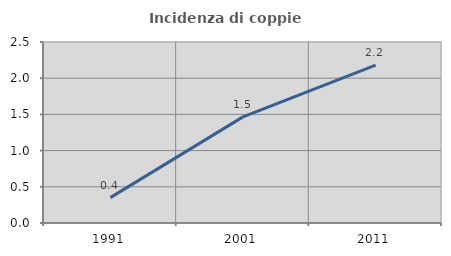
| Category | Incidenza di coppie miste |
|---|---|
| 1991.0 | 0.351 |
| 2001.0 | 1.465 |
| 2011.0 | 2.18 |